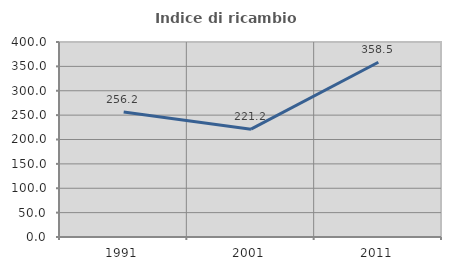
| Category | Indice di ricambio occupazionale  |
|---|---|
| 1991.0 | 256.209 |
| 2001.0 | 221.192 |
| 2011.0 | 358.491 |